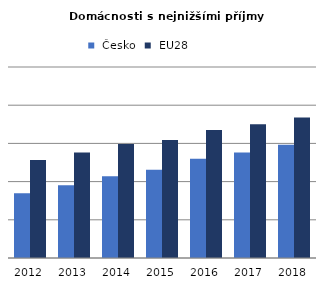
| Category |  Česko |  EU28 |
|---|---|---|
| 2012.0 | 33.87 | 51.359 |
| 2013.0 | 38.132 | 55.196 |
| 2014.0 | 42.809 | 59.735 |
| 2015.0 | 46.145 | 61.802 |
| 2016.0 | 51.925 | 67.058 |
| 2017.0 | 55.226 | 69.982 |
| 2018.0 | 59.333 | 73.584 |